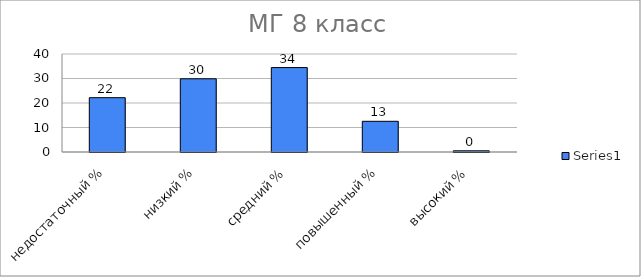
| Category | Series 0 |
|---|---|
| недостаточный % | 22.169 |
| низкий % | 29.88 |
| средний % | 34.458 |
| повышенный % | 12.53 |
| высокий % | 0.482 |